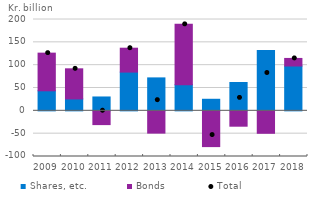
| Category | Shares, etc. | Bonds |
|---|---|---|
| 2009.0 | 43.857 | 82.487 |
| 2010.0 | 26.03 | 65.972 |
| 2011.0 | 30.354 | -30.159 |
| 2012.0 | 84.837 | 52.324 |
| 2013.0 | 72.129 | -48.786 |
| 2014.0 | 57.227 | 132.154 |
| 2015.0 | 25.309 | -78.338 |
| 2016.0 | 62.047 | -33.653 |
| 2017.0 | 132.01 | -49.178 |
| 2018.0 | 98.164 | 16.583 |